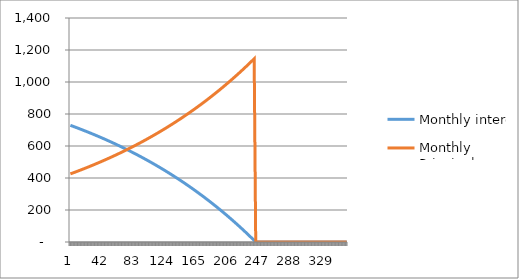
| Category | Monthly interest | Monthly Principal |
|---|---|---|
| 0 | 729.167 | 425.756 |
| 1 | 727.393 | 427.53 |
| 2 | 725.611 | 429.311 |
| 3 | 723.823 | 431.1 |
| 4 | 722.026 | 432.896 |
| 5 | 720.223 | 434.7 |
| 6 | 718.411 | 436.511 |
| 7 | 716.592 | 438.33 |
| 8 | 714.766 | 440.156 |
| 9 | 712.932 | 441.99 |
| 10 | 711.09 | 443.832 |
| 11 | 709.241 | 445.681 |
| 12 | 707.384 | 447.538 |
| 13 | 705.519 | 449.403 |
| 14 | 703.647 | 451.276 |
| 15 | 701.767 | 453.156 |
| 16 | 699.878 | 455.044 |
| 17 | 697.982 | 456.94 |
| 18 | 696.079 | 458.844 |
| 19 | 694.167 | 460.756 |
| 20 | 692.247 | 462.676 |
| 21 | 690.319 | 464.603 |
| 22 | 688.383 | 466.539 |
| 23 | 686.439 | 468.483 |
| 24 | 684.487 | 470.435 |
| 25 | 682.527 | 472.395 |
| 26 | 680.559 | 474.364 |
| 27 | 678.582 | 476.34 |
| 28 | 676.598 | 478.325 |
| 29 | 674.605 | 480.318 |
| 30 | 672.603 | 482.319 |
| 31 | 670.594 | 484.329 |
| 32 | 668.576 | 486.347 |
| 33 | 666.549 | 488.373 |
| 34 | 664.514 | 490.408 |
| 35 | 662.471 | 492.452 |
| 36 | 660.419 | 494.504 |
| 37 | 658.358 | 496.564 |
| 38 | 656.289 | 498.633 |
| 39 | 654.212 | 500.711 |
| 40 | 652.126 | 502.797 |
| 41 | 650.031 | 504.892 |
| 42 | 647.927 | 506.996 |
| 43 | 645.814 | 509.108 |
| 44 | 643.693 | 511.229 |
| 45 | 641.563 | 513.36 |
| 46 | 639.424 | 515.499 |
| 47 | 637.276 | 517.647 |
| 48 | 635.119 | 519.803 |
| 49 | 632.953 | 521.969 |
| 50 | 630.778 | 524.144 |
| 51 | 628.595 | 526.328 |
| 52 | 626.401 | 528.521 |
| 53 | 624.199 | 530.723 |
| 54 | 621.988 | 532.935 |
| 55 | 619.767 | 535.155 |
| 56 | 617.538 | 537.385 |
| 57 | 615.298 | 539.624 |
| 58 | 613.05 | 541.872 |
| 59 | 610.792 | 544.13 |
| 60 | 608.525 | 546.397 |
| 61 | 606.248 | 548.674 |
| 62 | 603.962 | 550.96 |
| 63 | 601.667 | 553.256 |
| 64 | 599.361 | 555.561 |
| 65 | 597.047 | 557.876 |
| 66 | 594.722 | 560.201 |
| 67 | 592.388 | 562.535 |
| 68 | 590.044 | 564.879 |
| 69 | 587.69 | 567.232 |
| 70 | 585.327 | 569.596 |
| 71 | 582.954 | 571.969 |
| 72 | 580.57 | 574.352 |
| 73 | 578.177 | 576.745 |
| 74 | 575.774 | 579.148 |
| 75 | 573.361 | 581.562 |
| 76 | 570.938 | 583.985 |
| 77 | 568.505 | 586.418 |
| 78 | 566.061 | 588.861 |
| 79 | 563.608 | 591.315 |
| 80 | 561.144 | 593.779 |
| 81 | 558.67 | 596.253 |
| 82 | 556.185 | 598.737 |
| 83 | 553.69 | 601.232 |
| 84 | 551.185 | 603.737 |
| 85 | 548.67 | 606.253 |
| 86 | 546.144 | 608.779 |
| 87 | 543.607 | 611.315 |
| 88 | 541.06 | 613.863 |
| 89 | 538.502 | 616.42 |
| 90 | 535.934 | 618.989 |
| 91 | 533.355 | 621.568 |
| 92 | 530.765 | 624.158 |
| 93 | 528.164 | 626.758 |
| 94 | 525.553 | 629.37 |
| 95 | 522.93 | 631.992 |
| 96 | 520.297 | 634.626 |
| 97 | 517.653 | 637.27 |
| 98 | 514.997 | 639.925 |
| 99 | 512.331 | 642.591 |
| 100 | 509.654 | 645.269 |
| 101 | 506.965 | 647.958 |
| 102 | 504.265 | 650.657 |
| 103 | 501.554 | 653.368 |
| 104 | 498.832 | 656.091 |
| 105 | 496.098 | 658.825 |
| 106 | 493.353 | 661.57 |
| 107 | 490.596 | 664.326 |
| 108 | 487.828 | 667.094 |
| 109 | 485.049 | 669.874 |
| 110 | 482.258 | 672.665 |
| 111 | 479.455 | 675.468 |
| 112 | 476.64 | 678.282 |
| 113 | 473.814 | 681.108 |
| 114 | 470.976 | 683.946 |
| 115 | 468.127 | 686.796 |
| 116 | 465.265 | 689.658 |
| 117 | 462.391 | 692.531 |
| 118 | 459.506 | 695.417 |
| 119 | 456.608 | 698.314 |
| 120 | 453.699 | 701.224 |
| 121 | 450.777 | 704.146 |
| 122 | 447.843 | 707.08 |
| 123 | 444.897 | 710.026 |
| 124 | 441.938 | 712.984 |
| 125 | 438.967 | 715.955 |
| 126 | 435.984 | 718.938 |
| 127 | 432.989 | 721.934 |
| 128 | 429.981 | 724.942 |
| 129 | 426.96 | 727.962 |
| 130 | 423.927 | 730.996 |
| 131 | 420.881 | 734.041 |
| 132 | 417.823 | 737.1 |
| 133 | 414.751 | 740.171 |
| 134 | 411.667 | 743.255 |
| 135 | 408.57 | 746.352 |
| 136 | 405.461 | 749.462 |
| 137 | 402.338 | 752.585 |
| 138 | 399.202 | 755.72 |
| 139 | 396.053 | 758.869 |
| 140 | 392.891 | 762.031 |
| 141 | 389.716 | 765.206 |
| 142 | 386.528 | 768.395 |
| 143 | 383.326 | 771.596 |
| 144 | 380.111 | 774.811 |
| 145 | 376.883 | 778.04 |
| 146 | 373.641 | 781.282 |
| 147 | 370.386 | 784.537 |
| 148 | 367.117 | 787.806 |
| 149 | 363.834 | 791.088 |
| 150 | 360.538 | 794.385 |
| 151 | 357.228 | 797.694 |
| 152 | 353.904 | 801.018 |
| 153 | 350.567 | 804.356 |
| 154 | 347.215 | 807.707 |
| 155 | 343.85 | 811.073 |
| 156 | 340.47 | 814.452 |
| 157 | 337.077 | 817.846 |
| 158 | 333.669 | 821.253 |
| 159 | 330.247 | 824.675 |
| 160 | 326.811 | 828.111 |
| 161 | 323.361 | 831.562 |
| 162 | 319.896 | 835.027 |
| 163 | 316.417 | 838.506 |
| 164 | 312.923 | 842 |
| 165 | 309.414 | 845.508 |
| 166 | 305.891 | 849.031 |
| 167 | 302.354 | 852.569 |
| 168 | 298.801 | 856.121 |
| 169 | 295.234 | 859.688 |
| 170 | 291.652 | 863.27 |
| 171 | 288.055 | 866.867 |
| 172 | 284.443 | 870.479 |
| 173 | 280.816 | 874.106 |
| 174 | 277.174 | 877.748 |
| 175 | 273.517 | 881.406 |
| 176 | 269.844 | 885.078 |
| 177 | 266.157 | 888.766 |
| 178 | 262.453 | 892.469 |
| 179 | 258.735 | 896.188 |
| 180 | 255.001 | 899.922 |
| 181 | 251.251 | 903.672 |
| 182 | 247.486 | 907.437 |
| 183 | 243.705 | 911.218 |
| 184 | 239.908 | 915.015 |
| 185 | 236.095 | 918.827 |
| 186 | 232.267 | 922.656 |
| 187 | 228.423 | 926.5 |
| 188 | 224.562 | 930.36 |
| 189 | 220.686 | 934.237 |
| 190 | 216.793 | 938.13 |
| 191 | 212.884 | 942.038 |
| 192 | 208.959 | 945.964 |
| 193 | 205.017 | 949.905 |
| 194 | 201.06 | 953.863 |
| 195 | 197.085 | 957.837 |
| 196 | 193.094 | 961.828 |
| 197 | 189.086 | 965.836 |
| 198 | 185.062 | 969.86 |
| 199 | 181.021 | 973.901 |
| 200 | 176.963 | 977.959 |
| 201 | 172.888 | 982.034 |
| 202 | 168.797 | 986.126 |
| 203 | 164.688 | 990.235 |
| 204 | 160.562 | 994.361 |
| 205 | 156.418 | 998.504 |
| 206 | 152.258 | 1002.664 |
| 207 | 148.08 | 1006.842 |
| 208 | 143.885 | 1011.037 |
| 209 | 139.672 | 1015.25 |
| 210 | 135.442 | 1019.48 |
| 211 | 131.194 | 1023.728 |
| 212 | 126.929 | 1027.994 |
| 213 | 122.646 | 1032.277 |
| 214 | 118.344 | 1036.578 |
| 215 | 114.025 | 1040.897 |
| 216 | 109.688 | 1045.234 |
| 217 | 105.333 | 1049.589 |
| 218 | 100.96 | 1053.963 |
| 219 | 96.568 | 1058.354 |
| 220 | 92.159 | 1062.764 |
| 221 | 87.73 | 1067.192 |
| 222 | 83.284 | 1071.639 |
| 223 | 78.819 | 1076.104 |
| 224 | 74.335 | 1080.588 |
| 225 | 69.832 | 1085.09 |
| 226 | 65.311 | 1089.611 |
| 227 | 60.771 | 1094.151 |
| 228 | 56.212 | 1098.71 |
| 229 | 51.634 | 1103.288 |
| 230 | 47.037 | 1107.885 |
| 231 | 42.421 | 1112.502 |
| 232 | 37.786 | 1117.137 |
| 233 | 33.131 | 1121.792 |
| 234 | 28.457 | 1126.466 |
| 235 | 23.763 | 1131.16 |
| 236 | 19.05 | 1135.873 |
| 237 | 14.317 | 1140.605 |
| 238 | 9.565 | 1145.358 |
| 239 | 4.792 | 1150.13 |
| 240 | 0 | 0 |
| 241 | 0 | 0 |
| 242 | 0 | 0 |
| 243 | 0 | 0 |
| 244 | 0 | 0 |
| 245 | 0 | 0 |
| 246 | 0 | 0 |
| 247 | 0 | 0 |
| 248 | 0 | 0 |
| 249 | 0 | 0 |
| 250 | 0 | 0 |
| 251 | 0 | 0 |
| 252 | 0 | 0 |
| 253 | 0 | 0 |
| 254 | 0 | 0 |
| 255 | 0 | 0 |
| 256 | 0 | 0 |
| 257 | 0 | 0 |
| 258 | 0 | 0 |
| 259 | 0 | 0 |
| 260 | 0 | 0 |
| 261 | 0 | 0 |
| 262 | 0 | 0 |
| 263 | 0 | 0 |
| 264 | 0 | 0 |
| 265 | 0 | 0 |
| 266 | 0 | 0 |
| 267 | 0 | 0 |
| 268 | 0 | 0 |
| 269 | 0 | 0 |
| 270 | 0 | 0 |
| 271 | 0 | 0 |
| 272 | 0 | 0 |
| 273 | 0 | 0 |
| 274 | 0 | 0 |
| 275 | 0 | 0 |
| 276 | 0 | 0 |
| 277 | 0 | 0 |
| 278 | 0 | 0 |
| 279 | 0 | 0 |
| 280 | 0 | 0 |
| 281 | 0 | 0 |
| 282 | 0 | 0 |
| 283 | 0 | 0 |
| 284 | 0 | 0 |
| 285 | 0 | 0 |
| 286 | 0 | 0 |
| 287 | 0 | 0 |
| 288 | 0 | 0 |
| 289 | 0 | 0 |
| 290 | 0 | 0 |
| 291 | 0 | 0 |
| 292 | 0 | 0 |
| 293 | 0 | 0 |
| 294 | 0 | 0 |
| 295 | 0 | 0 |
| 296 | 0 | 0 |
| 297 | 0 | 0 |
| 298 | 0 | 0 |
| 299 | 0 | 0 |
| 300 | 0 | 0 |
| 301 | 0 | 0 |
| 302 | 0 | 0 |
| 303 | 0 | 0 |
| 304 | 0 | 0 |
| 305 | 0 | 0 |
| 306 | 0 | 0 |
| 307 | 0 | 0 |
| 308 | 0 | 0 |
| 309 | 0 | 0 |
| 310 | 0 | 0 |
| 311 | 0 | 0 |
| 312 | 0 | 0 |
| 313 | 0 | 0 |
| 314 | 0 | 0 |
| 315 | 0 | 0 |
| 316 | 0 | 0 |
| 317 | 0 | 0 |
| 318 | 0 | 0 |
| 319 | 0 | 0 |
| 320 | 0 | 0 |
| 321 | 0 | 0 |
| 322 | 0 | 0 |
| 323 | 0 | 0 |
| 324 | 0 | 0 |
| 325 | 0 | 0 |
| 326 | 0 | 0 |
| 327 | 0 | 0 |
| 328 | 0 | 0 |
| 329 | 0 | 0 |
| 330 | 0 | 0 |
| 331 | 0 | 0 |
| 332 | 0 | 0 |
| 333 | 0 | 0 |
| 334 | 0 | 0 |
| 335 | 0 | 0 |
| 336 | 0 | 0 |
| 337 | 0 | 0 |
| 338 | 0 | 0 |
| 339 | 0 | 0 |
| 340 | 0 | 0 |
| 341 | 0 | 0 |
| 342 | 0 | 0 |
| 343 | 0 | 0 |
| 344 | 0 | 0 |
| 345 | 0 | 0 |
| 346 | 0 | 0 |
| 347 | 0 | 0 |
| 348 | 0 | 0 |
| 349 | 0 | 0 |
| 350 | 0 | 0 |
| 351 | 0 | 0 |
| 352 | 0 | 0 |
| 353 | 0 | 0 |
| 354 | 0 | 0 |
| 355 | 0 | 0 |
| 356 | 0 | 0 |
| 357 | 0 | 0 |
| 358 | 0 | 0 |
| 359 | 0 | 0 |